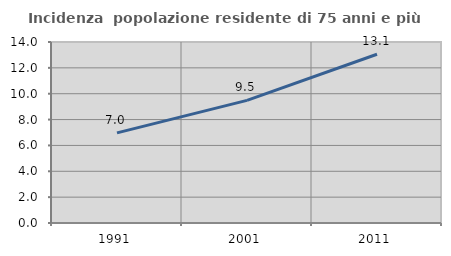
| Category | Incidenza  popolazione residente di 75 anni e più |
|---|---|
| 1991.0 | 6.97 |
| 2001.0 | 9.487 |
| 2011.0 | 13.05 |